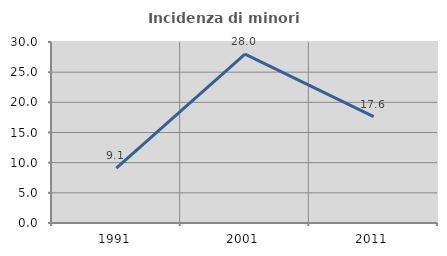
| Category | Incidenza di minori stranieri |
|---|---|
| 1991.0 | 9.091 |
| 2001.0 | 28 |
| 2011.0 | 17.647 |